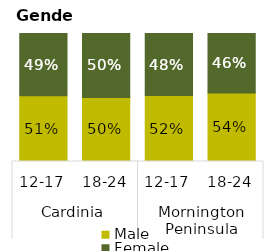
| Category | Male | Female |
|---|---|---|
| 0 | 0.514 | 0.486 |
| 1 | 0.501 | 0.499 |
| 2 | 0.516 | 0.484 |
| 3 | 0.536 | 0.464 |